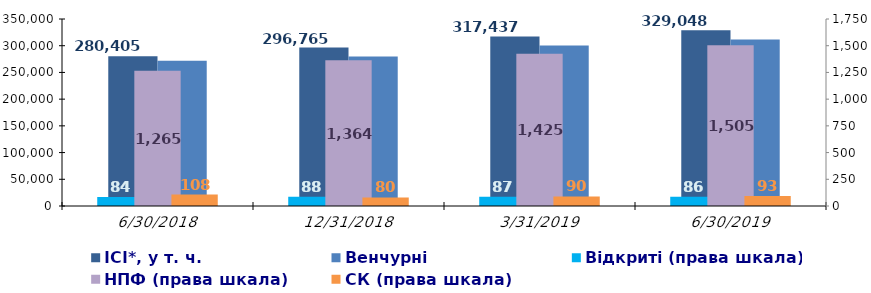
| Category | ІСІ*, у т. ч. | Венчурні |
|---|---|---|
| 6/30/18 | 280405.018 | 272052.334 |
| 12/31/18 | 296765.381 | 279713.253 |
| 3/31/19 | 317437.485 | 300241.731 |
| 6/30/19 | 329047.523 | 311811.926 |